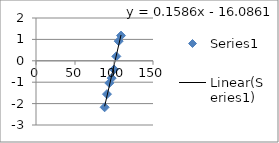
| Category | Series 0 |
|---|---|
| 88.0 | -2.172 |
| 91.0 | -1.557 |
| 94.0 | -1.04 |
| 97.0 | -0.81 |
| 100.0 | -0.404 |
| 103.0 | 0.207 |
| 106.0 | 0.919 |
| 109.0 | 1.178 |